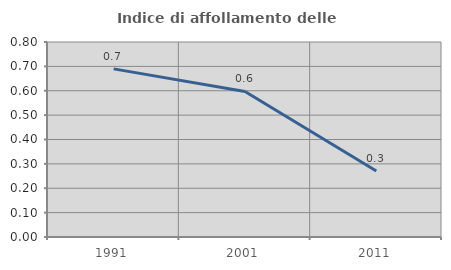
| Category | Indice di affollamento delle abitazioni  |
|---|---|
| 1991.0 | 0.69 |
| 2001.0 | 0.597 |
| 2011.0 | 0.271 |